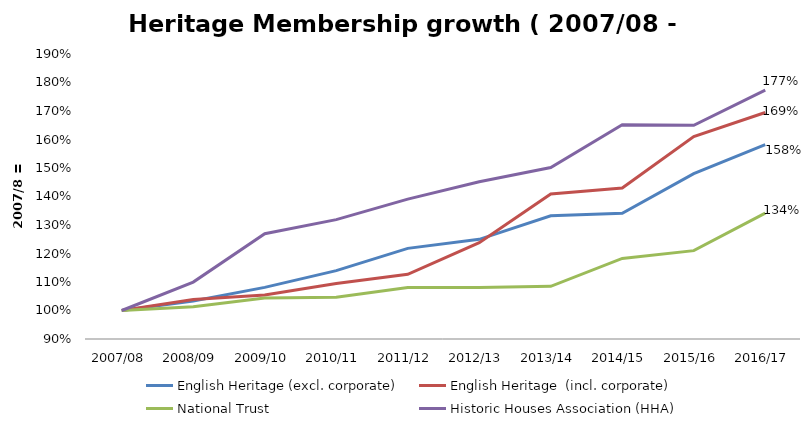
| Category | English Heritage (excl. corporate) | English Heritage  (incl. corporate) | National Trust  | Historic Houses Association (HHA)  |
|---|---|---|---|---|
| 2007/08 | 1 | 1 | 1 | 1 |
| 2008/09 | 1.033 | 1.038 | 1.013 | 1.1 |
| 2009/10 | 1.081 | 1.054 | 1.044 | 1.269 |
| 2010/11 | 1.14 | 1.095 | 1.047 | 1.319 |
| 2011/12 | 1.218 | 1.127 | 1.081 | 1.391 |
| 2012/13 | 1.25 | 1.238 | 1.08 | 1.452 |
| 2013/14 | 1.332 | 1.409 | 1.085 | 1.502 |
| 2014/15 | 1.341 | 1.43 | 1.183 | 1.652 |
| 2015/16 | 1.48 | 1.61 | 1.21 | 1.65 |
| 2016/17 | 1.582 | 1.695 | 1.342 | 1.773 |